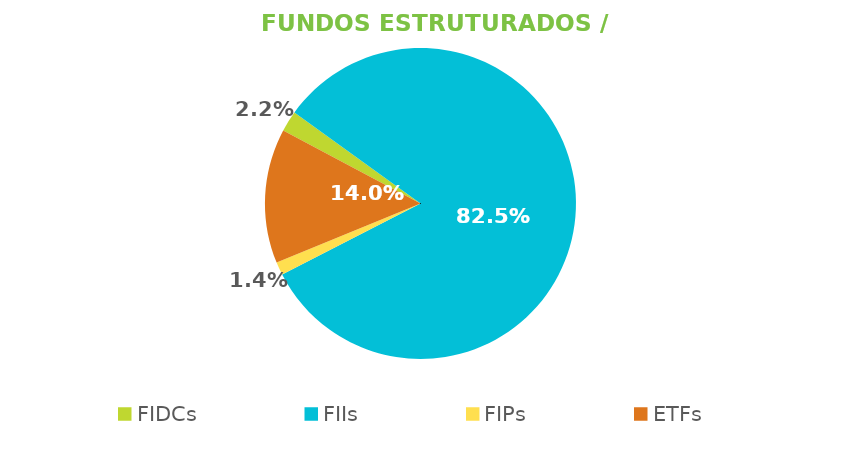
| Category | Fundos Estruturados / ETFs |
|---|---|
| FIDCs | 0.022 |
| FIIs | 0.825 |
| FIPs | 0.014 |
| ETFs | 0.14 |